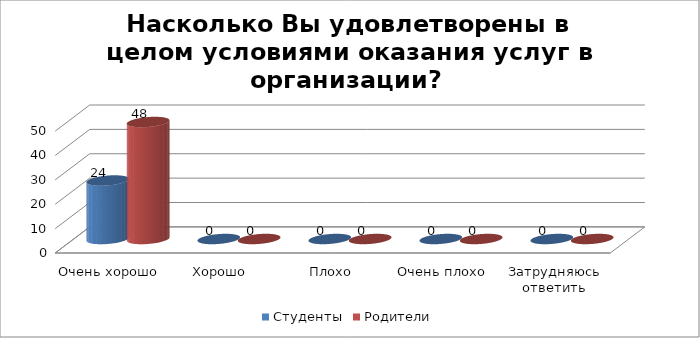
| Category | Студенты | Родители |
|---|---|---|
| Очень хорошо | 24 | 48 |
| Хорошо | 0 | 0 |
| Плохо | 0 | 0 |
| Очень плохо | 0 | 0 |
| Затрудняюсь ответить | 0 | 0 |